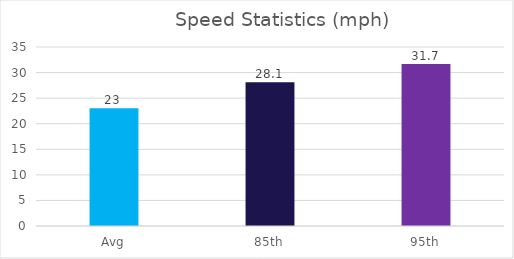
| Category | Series 0 |
|---|---|
| Avg | 23 |
| 85th | 28.1 |
| 95th | 31.7 |